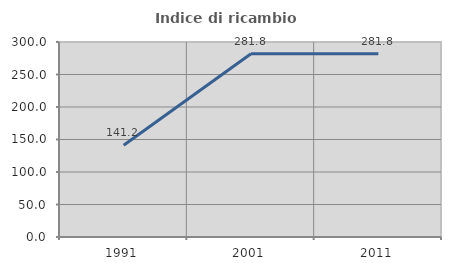
| Category | Indice di ricambio occupazionale  |
|---|---|
| 1991.0 | 141.176 |
| 2001.0 | 281.818 |
| 2011.0 | 281.818 |